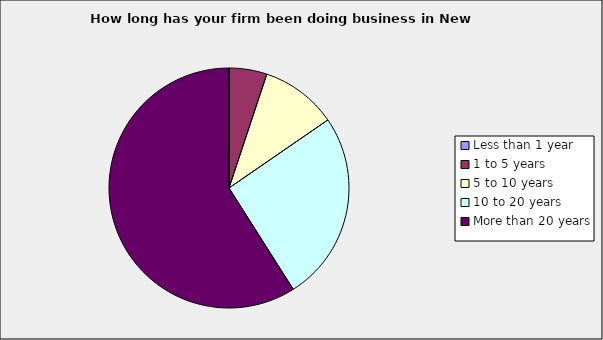
| Category | Series 0 |
|---|---|
| Less than 1 year | 0 |
| 1 to 5 years | 0.051 |
| 5 to 10 years | 0.103 |
| 10 to 20 years | 0.256 |
| More than 20 years | 0.59 |